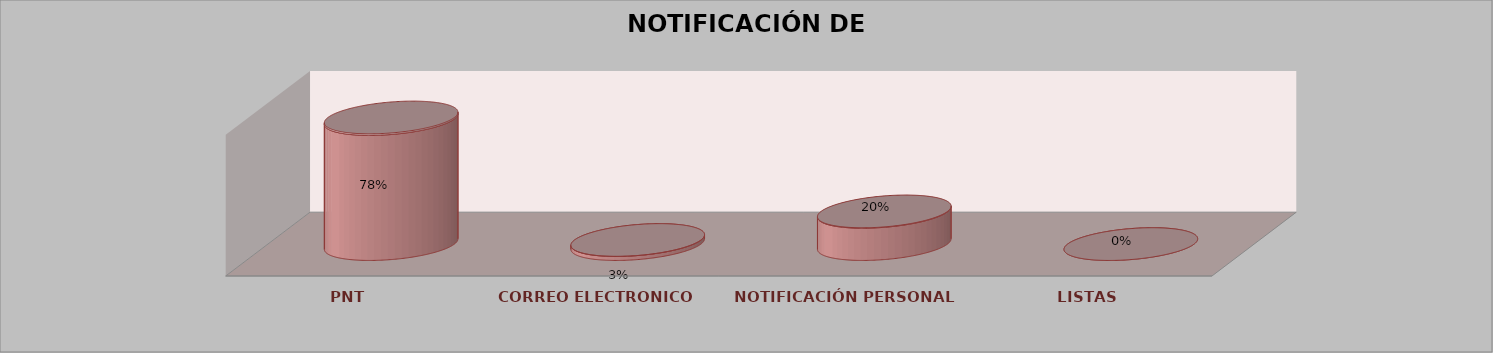
| Category | Series 0 | Series 1 | Series 2 | Series 3 | Series 4 |
|---|---|---|---|---|---|
| PNT |  |  |  | 62 | 0.775 |
| CORREO ELECTRONICO |  |  |  | 2 | 0.025 |
| NOTIFICACIÓN PERSONAL |  |  |  | 16 | 0.2 |
| LISTAS |  |  |  | 0 | 0 |